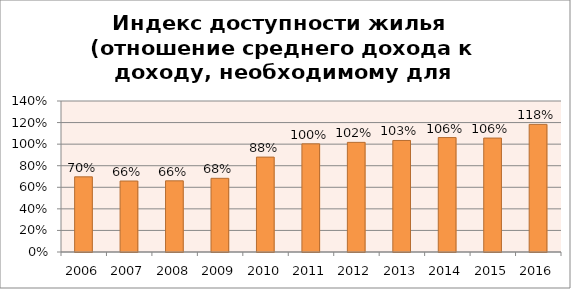
| Category | Series 0 |
|---|---|
| 2006.0 | 0.697 |
| 2007.0 | 0.658 |
| 2008.0 | 0.66 |
| 2009.0 | 0.683 |
| 2010.0 | 0.88 |
| 2011.0 | 1.003 |
| 2012.0 | 1.017 |
| 2013.0 | 1.034 |
| 2014.0 | 1.061 |
| 2015.0 | 1.056 |
| 2016.0 | 1.183 |